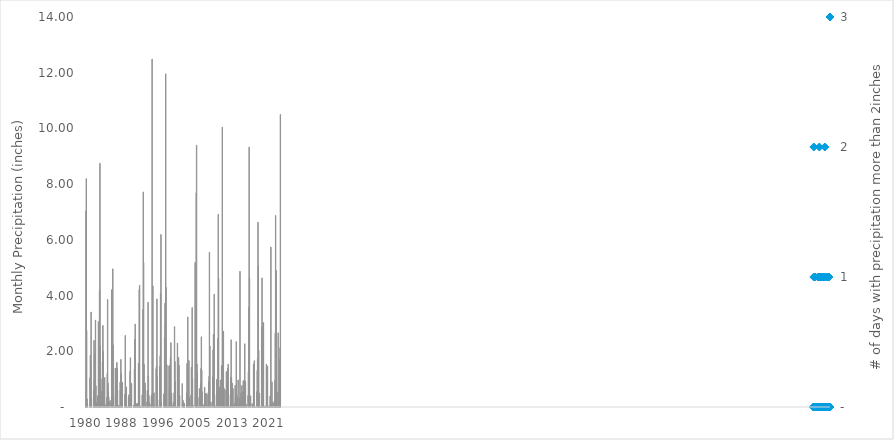
| Category | Rainfall |
|---|---|
| 1980.0 | 7.04 |
| 1980.0 | 8.2 |
| 1980.0 | 2.75 |
| 1980.0 | 0.29 |
| 1980.0 | 0.1 |
| 1980.0 | 0 |
| 1980.0 | 0 |
| 1980.0 | 0 |
| 1980.0 | 0 |
| 1980.0 | 0 |
| 1980.0 | 0 |
| 1980.0 | 1.05 |
| 1981.0 | 1.85 |
| 1981.0 | 1.5 |
| 1981.0 | 3.41 |
| 1981.0 | 0.32 |
| 1981.0 | 0 |
| 1981.0 | 0 |
| 1981.0 | 0 |
| 1981.0 | 0 |
| 1981.0 | 0 |
| 1981.0 | 0.59 |
| 1981.0 | 2.39 |
| 1981.0 | 0.98 |
| 1982.0 | 1.92 |
| 1982.0 | 0.2 |
| 1982.0 | 3.12 |
| 1982.0 | 0.76 |
| 1982.0 | 0.16 |
| 1982.0 | 0 |
| 1982.0 | 0 |
| 1982.0 | 0 |
| 1982.0 | 0.4 |
| 1982.0 | 0.19 |
| 1982.0 | 3.07 |
| 1982.0 | 0.92 |
| 1983.0 | 3.04 |
| 1983.0 | 4.17 |
| 1983.0 | 8.75 |
| 1983.0 | 2.18 |
| 1983.0 | 0.2 |
| 1983.0 | 0.01 |
| 1983.0 | 0 |
| 1983.0 | 0.57 |
| 1983.0 | 1.01 |
| 1983.0 | 1.62 |
| 1983.0 | 2.93 |
| 1983.0 | 1.99 |
| 1984.0 | 0.25 |
| 1984.0 | 0.01 |
| 1984.0 | 0.13 |
| 1984.0 | 1.06 |
| 1984.0 | 0 |
| 1984.0 | 0.01 |
| 1984.0 | 0.05 |
| 1984.0 | 0.08 |
| 1984.0 | 0.15 |
| 1984.0 | 0.35 |
| 1984.0 | 1.2 |
| 1984.0 | 3.86 |
| 1985.0 | 0.86 |
| 1985.0 | 0.57 |
| 1985.0 | 0.36 |
| 1985.0 | 0 |
| 1985.0 | 0.21 |
| 1985.0 | 0 |
| 1985.0 | 0 |
| 1985.0 | 0 |
| 1985.0 | 0.24 |
| 1985.0 | 0.14 |
| 1985.0 | 4.21 |
| 1985.0 | 0.33 |
| 1986.0 | 1.74 |
| 1986.0 | 4.96 |
| 1986.0 | 2.23 |
| 1986.0 | 0.43 |
| 1986.0 | 0 |
| 1986.0 | 0 |
| 1986.0 | 0.03 |
| 1986.0 | 0 |
| 1986.0 | 1.4 |
| 1986.0 | 0.38 |
| 1986.0 | 0.87 |
| 1986.0 | 0.27 |
| 1987.0 | 1.6 |
| 1987.0 | 1.38 |
| 1987.0 | 0.61 |
| 1987.0 | 0.05 |
| 1987.0 | 0 |
| 1987.0 | 0.04 |
| 1987.0 | 0.05 |
| 1987.0 | 0.04 |
| 1987.0 | 0.02 |
| 1987.0 | 0.89 |
| 1987.0 | 0.6 |
| 1987.0 | 1.71 |
| 1988.0 | 1.2 |
| 1988.0 | 0.47 |
| 1988.0 | 0.01 |
| 1988.0 | 0.88 |
| 1988.0 | 0 |
| 1988.0 | 0 |
| 1988.0 | 0 |
| 1988.0 | 0 |
| 1988.0 | 0 |
| 1988.0 | 0 |
| 1988.0 | 0.46 |
| 1988.0 | 2.57 |
| 1989.0 | 0.33 |
| 1989.0 | 0.66 |
| 1989.0 | 0.72 |
| 1989.0 | 0 |
| 1989.0 | 0.02 |
| 1989.0 | 0 |
| 1989.0 | 0 |
| 1989.0 | 0 |
| 1989.0 | 0.34 |
| 1989.0 | 0.44 |
| 1989.0 | 0.05 |
| 1989.0 | 0 |
| 1990.0 | 1.27 |
| 1990.0 | 1.77 |
| 1990.0 | 0.08 |
| 1990.0 | 0.5 |
| 1990.0 | 0.85 |
| 1990.0 | 0 |
| 1990.0 | 0 |
| 1990.0 | 0 |
| 1990.0 | 0 |
| 1990.0 | 0 |
| 1990.0 | 0.07 |
| 1990.0 | 0.02 |
| 1991.0 | 1.37 |
| 1991.0 | 2.43 |
| 1991.0 | 2.98 |
| 1991.0 | 0.05 |
| 1991.0 | 0 |
| 1991.0 | 0 |
| 1991.0 | 0.12 |
| 1991.0 | 0.01 |
| 1991.0 | 0.02 |
| 1991.0 | 0.14 |
| 1991.0 | 0.05 |
| 1991.0 | 1.57 |
| 1992.0 | 1.41 |
| 1992.0 | 4.22 |
| 1992.0 | 4.37 |
| 1992.0 | 0.02 |
| 1992.0 | 0.02 |
| 1992.0 | 0 |
| 1992.0 | 0.03 |
| 1992.0 | 0 |
| 1992.0 | 0 |
| 1992.0 | 0.43 |
| 1992.0 | 0 |
| 1992.0 | 3.5 |
| 1993.0 | 7.72 |
| 1993.0 | 5.18 |
| 1993.0 | 1.53 |
| 1993.0 | 0 |
| 1993.0 | 0 |
| 1993.0 | 0.86 |
| 1993.0 | 0 |
| 1993.0 | 0 |
| 1993.0 | 0 |
| 1993.0 | 0.02 |
| 1993.0 | 0.18 |
| 1993.0 | 0.6 |
| 1994.0 | 0.24 |
| 1994.0 | 3.76 |
| 1994.0 | 1.12 |
| 1994.0 | 0.42 |
| 1994.0 | 0.16 |
| 1994.0 | 0 |
| 1994.0 | 0 |
| 1994.0 | 0 |
| 1994.0 | 0 |
| 1994.0 | 0.09 |
| 1994.0 | 0.38 |
| 1994.0 | 0.44 |
| 1995.0 | 12.49 |
| 1995.0 | 0.48 |
| 1995.0 | 4.35 |
| 1995.0 | 0.45 |
| 1995.0 | 0.02 |
| 1995.0 | 0.51 |
| 1995.0 | 0.05 |
| 1995.0 | 0 |
| 1995.0 | 0 |
| 1995.0 | 0 |
| 1995.0 | 0.02 |
| 1995.0 | 1.37 |
| 1996.0 | 1.46 |
| 1996.0 | 3.88 |
| 1996.0 | 1.09 |
| 1996.0 | 0.26 |
| 1996.0 | 0.02 |
| 1996.0 | 0 |
| 1996.0 | 0 |
| 1996.0 | 0 |
| 1996.0 | 0.01 |
| 1996.0 | 1.46 |
| 1996.0 | 1.84 |
| 1996.0 | 4.08 |
| 1997.0 | 6.19 |
| 1997.0 | 0.15 |
| 1997.0 | 0 |
| 1997.0 | 0 |
| 1997.0 | 0 |
| 1997.0 | 0 |
| 1997.0 | 0 |
| 1997.0 | 0 |
| 1997.0 | 0.47 |
| 1997.0 | 0 |
| 1997.0 | 2.51 |
| 1997.0 | 3.72 |
| 1998.0 | 2.97 |
| 1998.0 | 11.96 |
| 1998.0 | 4.29 |
| 1998.0 | 1.55 |
| 1998.0 | 1.5 |
| 1998.0 | 0.03 |
| 1998.0 | 0 |
| 1998.0 | 0 |
| 1998.0 | 0 |
| 1998.0 | 0.04 |
| 1998.0 | 1.47 |
| 1998.0 | 0.61 |
| 1999.0 | 1.5 |
| 1999.0 | 0.37 |
| 1999.0 | 1.79 |
| 1999.0 | 2.31 |
| 1999.0 | 0.05 |
| 1999.0 | 0.49 |
| 1999.0 | 0.07 |
| 1999.0 | 0 |
| 1999.0 | 0 |
| 1999.0 | 0.01 |
| 1999.0 | 0.18 |
| 1999.0 | 0.12 |
| 2000.0 | 0.514 |
| 2000.0 | 2.889 |
| 2000.0 | 1.632 |
| 2000.0 | 0.921 |
| 2000.0 | 0.033 |
| 2000.0 | 0 |
| 2000.0 | 0 |
| 2000.0 | 0 |
| 2000.0 | 0.001 |
| 2000.0 | 2.293 |
| 2000.0 | 0 |
| 2000.0 | 0 |
| 2001.0 | 1.78 |
| 2001.0 | 1.5 |
| 2001.0 | 0.26 |
| 2001.0 | 0.41 |
| 2001.0 | 0 |
| 2001.0 | 0 |
| 2001.0 | 0 |
| 2001.0 | 0 |
| 2001.0 | 0 |
| 2001.0 | 0 |
| 2001.0 | 0.84 |
| 2001.0 | 0.16 |
| 2002.0 | 0.24 |
| 2002.0 | 0.07 |
| 2002.0 | 0.05 |
| 2002.0 | 0.14 |
| 2002.0 | 0.09 |
| 2002.0 | 0 |
| 2002.0 | 0 |
| 2002.0 | 0 |
| 2002.0 | 0 |
| 2002.0 | 0 |
| 2002.0 | 0.51 |
| 2002.0 | 1.56 |
| 2003.0 | 0 |
| 2003.0 | 3.23 |
| 2003.0 | 1.18 |
| 2003.0 | 0.35 |
| 2003.0 | 1.67 |
| 2003.0 | 0.06 |
| 2003.0 | 0.34 |
| 2003.0 | 0 |
| 2003.0 | 0 |
| 2003.0 | 0.03 |
| 2003.0 | 0.43 |
| 2003.0 | 1.43 |
| 2004.0 | 0.63 |
| 2004.0 | 3.57 |
| 2004.0 | 1.02 |
| 2004.0 | 0.06 |
| 2004.0 | 0 |
| 2004.0 | 0 |
| 2004.0 | 0 |
| 2004.0 | 0 |
| 2004.0 | 0 |
| 2004.0 | 5.19 |
| 2004.0 | 0.37 |
| 2004.0 | 3.76 |
| 2005.0 | 7.69 |
| 2005.0 | 9.4 |
| 2005.0 | 1.54 |
| 2005.0 | 1.23 |
| 2005.0 | 0.04 |
| 2005.0 | 0.01 |
| 2005.0 | 0 |
| 2005.0 | 0 |
| 2005.0 | 0.34 |
| 2005.0 | 0.66 |
| 2005.0 | 0.13 |
| 2005.0 | 0.56 |
| 2006.0 | 0.86 |
| 2006.0 | 1.38 |
| 2006.0 | 2.52 |
| 2006.0 | 1.33 |
| 2006.0 | 0.55 |
| 2006.0 | 0 |
| 2006.0 | 0.03 |
| 2006.0 | 0.01 |
| 2006.0 | 0 |
| 2006.0 | 0.07 |
| 2006.0 | 0.11 |
| 2006.0 | 0.71 |
| 2007.0 | 0.2 |
| 2007.0 | 0.49 |
| 2007.0 | 0.03 |
| 2007.0 | 0.48 |
| 2007.0 | 0 |
| 2007.0 | 0 |
| 2007.0 | 0 |
| 2007.0 | 0.06 |
| 2007.0 | 0.46 |
| 2007.0 | 0.54 |
| 2007.0 | 0.91 |
| 2007.0 | 1.1 |
| 2008.0 | 5.56 |
| 2008.0 | 2.19 |
| 2008.0 | 0 |
| 2008.0 | 0.04 |
| 2008.0 | 0.18 |
| 2008.0 | 0 |
| 2008.0 | 0 |
| 2008.0 | 0 |
| 2008.0 | 0.01 |
| 2008.0 | 1.07 |
| 2008.0 | 2.05 |
| 2008.0 | 2.61 |
| 2009.0 | 0.17 |
| 2009.0 | 4.05 |
| 2009.0 | 0.42 |
| 2009.0 | 0.01 |
| 2009.0 | 0 |
| 2009.0 | 0.04 |
| 2009.0 | 0 |
| 2009.0 | 0 |
| 2009.0 | 0.99 |
| 2009.0 | 0.6 |
| 2009.0 | 0 |
| 2009.0 | 2.46 |
| 2010.0 | 6.92 |
| 2010.0 | 4.62 |
| 2010.0 | 0.15 |
| 2010.0 | 0.71 |
| 2010.0 | 0.02 |
| 2010.0 | 0.01 |
| 2010.0 | 0.97 |
| 2010.0 | 0 |
| 2010.0 | 0 |
| 2010.0 | 1.49 |
| 2010.0 | 0.53 |
| 2010.0 | 10.05 |
| 2011.0 | 1.161 |
| 2011.0 | 1.602 |
| 2011.0 | 2.723 |
| 2011.0 | 0.05 |
| 2011.0 | 0.661 |
| 2011.0 | 0.011 |
| 2011.0 | 0 |
| 2011.0 | 0 |
| 2011.0 | 0.021 |
| 2011.0 | 0.611 |
| 2011.0 | 1.252 |
| 2011.0 | 1.281 |
| 2012.0 | 1.14 |
| 2012.0 | 0.322 |
| 2012.0 | 1.392 |
| 2012.0 | 1.541 |
| 2012.0 | 0.02 |
| 2012.0 | 0 |
| 2012.0 | 0.031 |
| 2012.0 | 0 |
| 2012.0 | 0.011 |
| 2012.0 | 0.441 |
| 2012.0 | 1.063 |
| 2012.0 | 2.414 |
| 2013.0 | 1.042 |
| 2013.0 | 0.301 |
| 2013.0 | 0.851 |
| 2013.0 | 0.02 |
| 2013.0 | 0.661 |
| 2013.0 | 0 |
| 2013.0 | 0.071 |
| 2013.0 | 0 |
| 2013.0 | 0 |
| 2013.0 | 0.131 |
| 2013.0 | 0.781 |
| 2013.0 | 0.34 |
| 2014.0 | 0.02 |
| 2014.0 | 2.351 |
| 2014.0 | 0.471 |
| 2014.0 | 0.371 |
| 2014.0 | 0 |
| 2014.0 | 0 |
| 2014.0 | 0.97 |
| 2014.0 | 0.071 |
| 2014.0 | 0.111 |
| 2014.0 | 0.07 |
| 2014.0 | 0.321 |
| 2014.0 | 4.873 |
| 2015.0 | 0.02 |
| 2015.0 | 0.24 |
| 2015.0 | 0.49 |
| 2015.0 | 0.22 |
| 2015.0 | 0.77 |
| 2015.0 | 0.01 |
| 2015.0 | 0.54 |
| 2015.0 | 0 |
| 2015.0 | 0.95 |
| 2015.0 | 0.04 |
| 2015.0 | 0.06 |
| 2015.0 | 0.9 |
| 2016.0 | 2.27 |
| 2016.0 | 0.61 |
| 2016.0 | 0.92 |
| 2016.0 | 0.11 |
| 2016.0 | 0.05 |
| 2016.0 | 0.01 |
| 2016.0 | 0 |
| 2016.0 | 0 |
| 2016.0 | 0 |
| 2016.0 | 0.41 |
| 2016.0 | 1.27 |
| 2016.0 | 3.59 |
| 2017.0 | 9.33 |
| 2017.0 | 4.62 |
| 2017.0 | 0.15 |
| 2017.0 | 0.18 |
| 2017.0 | 0.4 |
| 2017.0 | 0 |
| 2017.0 | 0 |
| 2017.0 | 0 |
| 2017.0 | 0.12 |
| 2017.0 | 0 |
| 2017.0 | 0.072 |
| 2017.0 | 0 |
| 2018.0 | 1.532 |
| 2018.0 | 0.291 |
| 2018.0 | 1.664 |
| 2018.0 | 0.04 |
| 2018.0 | 0.011 |
| 2018.0 | 0 |
| 2018.0 | 0 |
| 2018.0 | 0 |
| 2018.0 | 0 |
| 2018.0 | 0.551 |
| 2018.0 | 1.311 |
| 2018.0 | 1.752 |
| 2019.0 | 6.632 |
| 2019.0 | 5.067 |
| 2019.0 | 2.033 |
| 2019.0 | 0.021 |
| 2019.0 | 0.503 |
| 2019.0 | 0.03 |
| 2019.0 | 0.01 |
| 2019.0 | 0 |
| 2019.0 | 0 |
| 2019.0 | 0 |
| 2019.0 | 2.863 |
| 2019.0 | 4.633 |
| 2020.0 | 0.31 |
| 2020.0 | 0.332 |
| 2020.0 | 3.015 |
| 2020.0 | 3.033 |
| 2020.0 | 0.041 |
| 2020.0 | 0.001 |
| 2020.0 | 0 |
| 2020.0 | 0 |
| 2020.0 | 0 |
| 2020.0 | 0.03 |
| 2020.0 | 0.043 |
| 2020.0 | 1.54 |
| 2021.0 | 1.252 |
| 2021.0 | 0.07 |
| 2021.0 | 1.472 |
| 2021.0 | 0.021 |
| 2021.0 | 0.001 |
| 2021.0 | 0 |
| 2021.0 | 0.03 |
| 2021.0 | 0.041 |
| 2021.0 | 0 |
| 2021.0 | 0.392 |
| 2021.0 | 0 |
| 2021.0 | 5.744 |
| 2022.0 | 0.011 |
| 2022.0 | 0.081 |
| 2022.0 | 0.902 |
| 2022.0 | 0.152 |
| 2022.0 | 0 |
| 2022.0 | 0.12 |
| 2022.0 | 0 |
| 2022.0 | 0 |
| 2022.0 | 0.201 |
| 2022.0 | 0.181 |
| 2022.0 | 0.962 |
| 2022.0 | 2.643 |
| 2023.0 | 6.874 |
| 2023.0 | 2.893 |
| 2023.0 | 4.895 |
| 2023.0 | 0.071 |
| 2023.0 | 0.541 |
| 2023.0 | 0 |
| 2023.0 | 0 |
| 2023.0 | 2.661 |
| 2023.0 | 0.021 |
| 2023.0 | 0.01 |
| 2023.0 | 0.532 |
| 2023.0 | 1.712 |
| 2024.0 | 2.122 |
| 2024.0 | 10.502 |